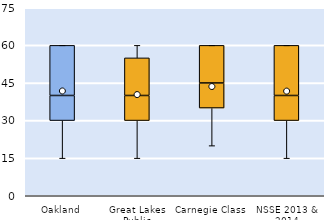
| Category | 25th | 50th | 75th |
|---|---|---|---|
| Oakland | 30 | 10 | 20 |
| Great Lakes Public | 30 | 10 | 15 |
| Carnegie Class | 35 | 10 | 15 |
| NSSE 2013 & 2014 | 30 | 10 | 20 |